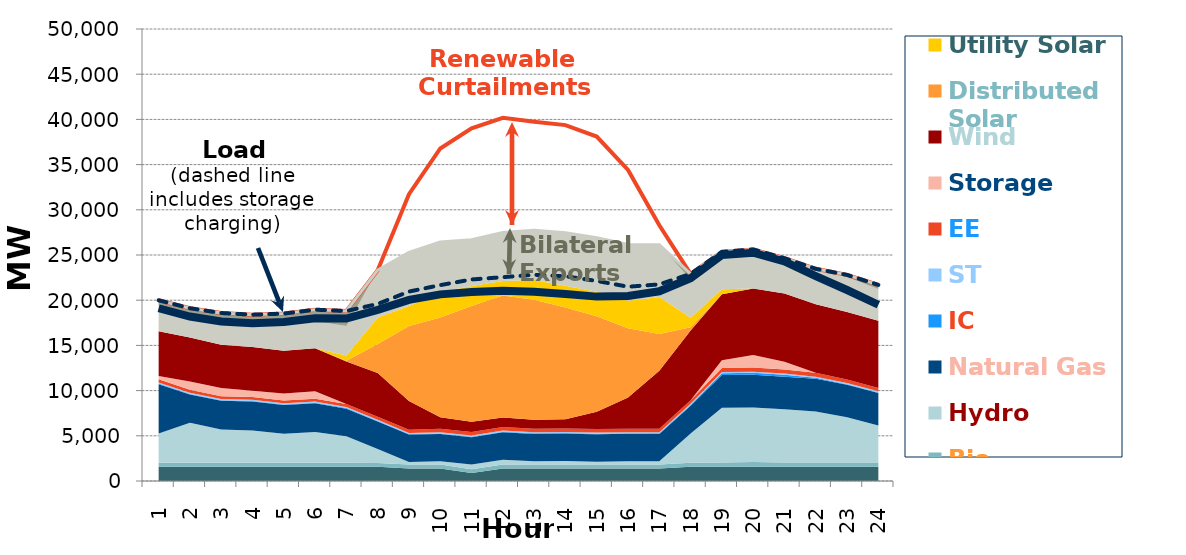
| Category | Gen+Curtailments | Load+Exports | Load+Charging | Load |
|---|---|---|---|---|
| 1.0 | 19989.553 | 19989.553 | 19989.553 | 19108.593 |
| 2.0 | 19110.783 | 19110.783 | 19110.783 | 18191.404 |
| 3.0 | 18582.075 | 18582.075 | 18582.075 | 17643.321 |
| 4.0 | 18398.09 | 18398.09 | 18398.09 | 17463.018 |
| 5.0 | 18516.944 | 18516.944 | 18516.944 | 17584.074 |
| 6.0 | 18950.541 | 18950.541 | 18950.541 | 18002.513 |
| 7.0 | 18805.023 | 18805.023 | 18805.023 | 17976.048 |
| 8.0 | 23324.142 | 23324.142 | 19584.403 | 18936.158 |
| 9.0 | 31725.444 | 25282.918 | 20955.981 | 20032.568 |
| 10.0 | 36784.637 | 26449.779 | 21668.659 | 20645.515 |
| 11.0 | 39016.186 | 26698.587 | 22292.138 | 20917.071 |
| 12.0 | 40180.822 | 27481.892 | 22548.849 | 21039.108 |
| 13.0 | 39729.594 | 27750.472 | 22810.408 | 20942.751 |
| 14.0 | 39370.253 | 27467.203 | 22640.841 | 20690.194 |
| 15.0 | 38106.435 | 26918.83 | 22131.75 | 20396.672 |
| 16.0 | 34402.627 | 26155.948 | 21491.198 | 20476.523 |
| 17.0 | 28293.08 | 26141.886 | 21748.598 | 20985.599 |
| 18.0 | 22910.908 | 22910.908 | 22910.908 | 22436.262 |
| 19.0 | 25350.371 | 25350.371 | 25350.371 | 24993.527 |
| 20.0 | 25619.202 | 25619.202 | 25619.202 | 25256.415 |
| 21.0 | 24641.836 | 24641.836 | 24641.836 | 24289.8 |
| 22.0 | 23469.639 | 23469.639 | 23469.639 | 22672.877 |
| 23.0 | 22799.41 | 22799.41 | 22799.41 | 21127.19 |
| 24.0 | 21690.873 | 21690.873 | 21690.873 | 19496.94 |